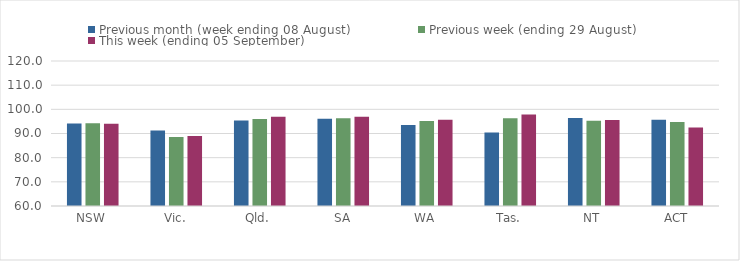
| Category | Previous month (week ending 08 August) | Previous week (ending 29 August) | This week (ending 05 September) |
|---|---|---|---|
| NSW | 94.14 | 94.27 | 94.08 |
| Vic. | 91.28 | 88.55 | 88.94 |
| Qld. | 95.33 | 95.98 | 96.94 |
| SA | 96.1 | 96.36 | 96.89 |
| WA | 93.54 | 95.21 | 95.66 |
| Tas. | 90.37 | 96.31 | 97.85 |
| NT | 96.45 | 95.28 | 95.54 |
| ACT | 95.65 | 94.72 | 92.53 |